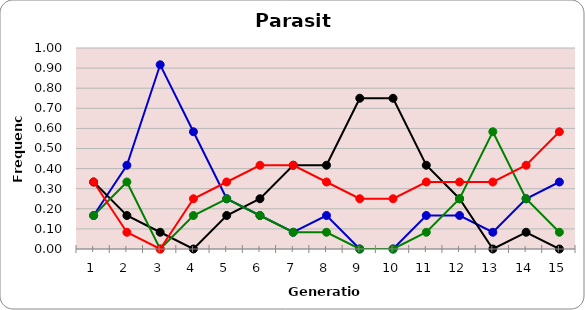
| Category | Sp | Cl | Di | He |
|---|---|---|---|---|
| 1.0 | 0.167 | 0.333 | 0.167 | 0.333 |
| 2.0 | 0.417 | 0.167 | 0.333 | 0.083 |
| 3.0 | 0.917 | 0.083 | 0 | 0 |
| 4.0 | 0.583 | 0 | 0.167 | 0.25 |
| 5.0 | 0.25 | 0.167 | 0.25 | 0.333 |
| 6.0 | 0.167 | 0.25 | 0.167 | 0.417 |
| 7.0 | 0.083 | 0.417 | 0.083 | 0.417 |
| 8.0 | 0.167 | 0.417 | 0.083 | 0.333 |
| 9.0 | 0 | 0.75 | 0 | 0.25 |
| 10.0 | 0 | 0.75 | 0 | 0.25 |
| 11.0 | 0.167 | 0.417 | 0.083 | 0.333 |
| 12.0 | 0.167 | 0.25 | 0.25 | 0.333 |
| 13.0 | 0.083 | 0 | 0.583 | 0.333 |
| 14.0 | 0.25 | 0.083 | 0.25 | 0.417 |
| 15.0 | 0.333 | 0 | 0.083 | 0.583 |